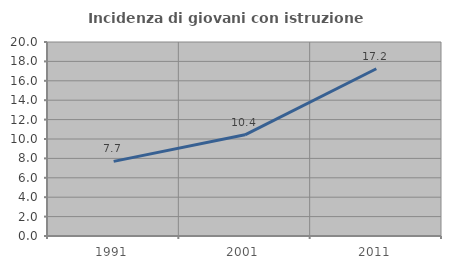
| Category | Incidenza di giovani con istruzione universitaria |
|---|---|
| 1991.0 | 7.692 |
| 2001.0 | 10.432 |
| 2011.0 | 17.241 |